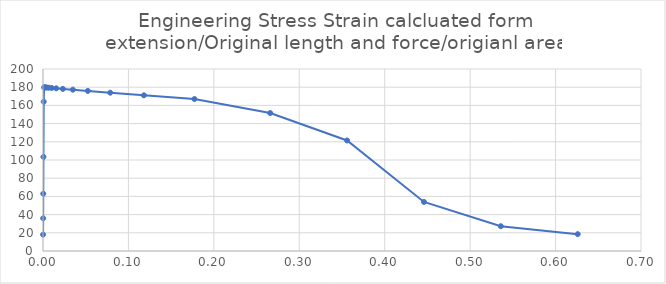
| Category | Series 0 |
|---|---|
| 9e-05 | 17.998 |
| 0.00018 | 35.993 |
| 0.000315 | 62.979 |
| 0.0005175 | 103.443 |
| 0.00082125 | 164.106 |
| 0.00127688 | 179.873 |
| 0.00196031 | 179.819 |
| 0.00298547 | 179.738 |
| 0.0045232 | 179.616 |
| 0.0068298 | 179.434 |
| 0.0102897 | 179.161 |
| 0.0154796 | 178.754 |
| 0.0232643 | 178.148 |
| 0.0349415 | 177.246 |
| 0.0524573 | 175.913 |
| 0.0787309 | 173.954 |
| 0.118141 | 171.106 |
| 0.177257 | 167.022 |
| 0.265931 | 151.601 |
| 0.355931 | 121.438 |
| 0.445931 | 53.918 |
| 0.535931 | 27.245 |
| 0.625931 | 18.536 |